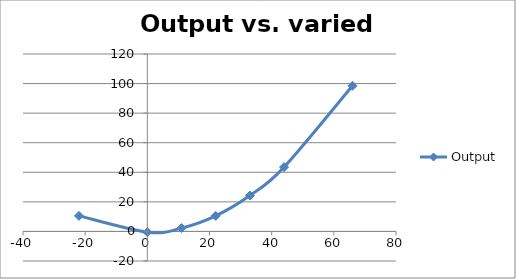
| Category | Output |
|---|---|
| -22.0 | 10.5 |
| 0.0 | -0.5 |
| 11.0 | 2.25 |
| 22.0 | 10.5 |
| 33.0 | 24.25 |
| 44.0 | 43.5 |
| 66.0 | 98.5 |